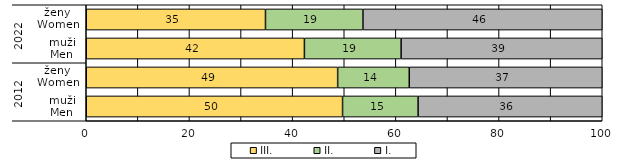
| Category | III. | II. | I. |
|---|---|---|---|
| 0 | 49.67 | 14.64 | 35.69 |
| 1 | 48.724 | 13.878 | 37.398 |
| 2 | 42.277 | 18.741 | 38.982 |
| 3 | 34.733 | 18.889 | 46.377 |